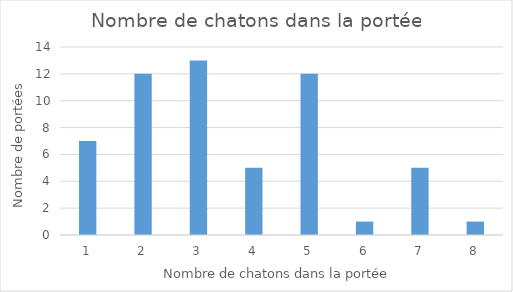
| Category | Series 0 |
|---|---|
| 1.0 | 7 |
| 2.0 | 12 |
| 3.0 | 13 |
| 4.0 | 5 |
| 5.0 | 12 |
| 6.0 | 1 |
| 7.0 | 5 |
| 8.0 | 1 |